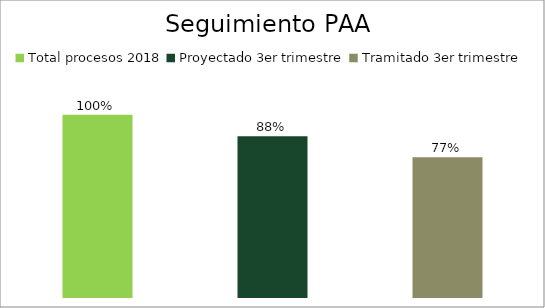
| Category | Series 0 |
|---|---|
| Total procesos 2018 | 1 |
| Proyectado 3er trimestre | 0.882 |
| Tramitado 3er trimestre | 0.767 |